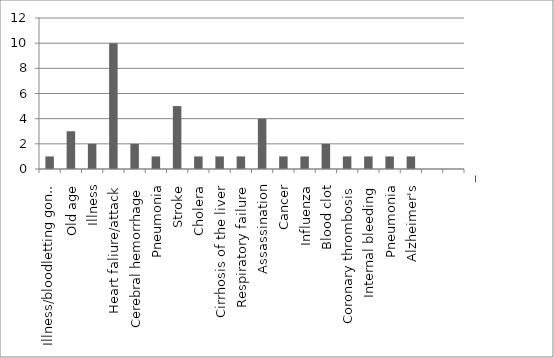
| Category | Series 0 |
|---|---|
| Illness/bloodletting gone wrong | 1 |
| Old age | 3 |
| Illness | 2 |
| Heart faliure/attack | 10 |
| Cerebral hemorrhage | 2 |
| Pneumonia | 1 |
| Stroke | 5 |
| Cholera | 1 |
| Cirrhosis of the liver | 1 |
| Respiratory failure | 1 |
| Assassination | 4 |
| Cancer | 1 |
| Influenza | 1 |
| Blood clot | 2 |
| Coronary thrombosis | 1 |
| Internal bleeding | 1 |
| Pneumonia | 1 |
| Alzheimer's | 1 |